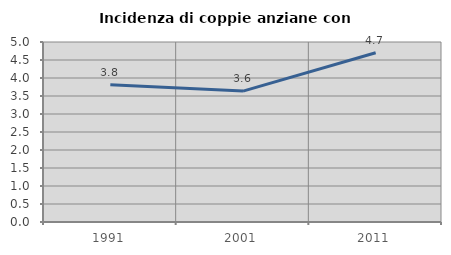
| Category | Incidenza di coppie anziane con figli |
|---|---|
| 1991.0 | 3.81 |
| 2001.0 | 3.636 |
| 2011.0 | 4.702 |